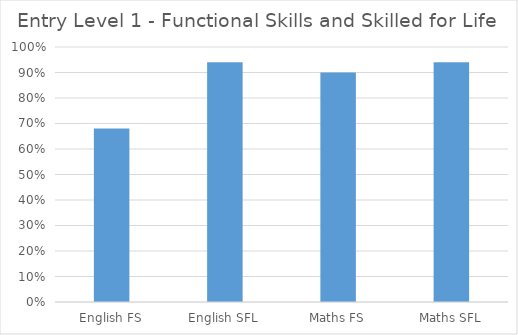
| Category | Entry Level 1 |
|---|---|
| English FS | 0.68 |
| English SFL | 0.94 |
| Maths FS | 0.9 |
| Maths SFL | 0.94 |